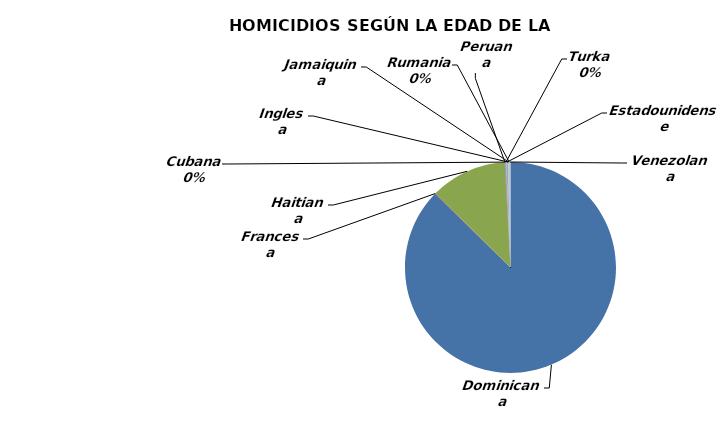
| Category | Dominicana |
|---|---|
| Dominicana | 1082 |
| Francesa | 1 |
| Haitiana | 145 |
| Peruana | 1 |
| Cubana | 1 |
| Turka | 1 |
| Estadounidense | 3 |
| Inglesa | 1 |
| Jamaiquina | 1 |
| Rumania | 1 |
| Venezolana | 2 |